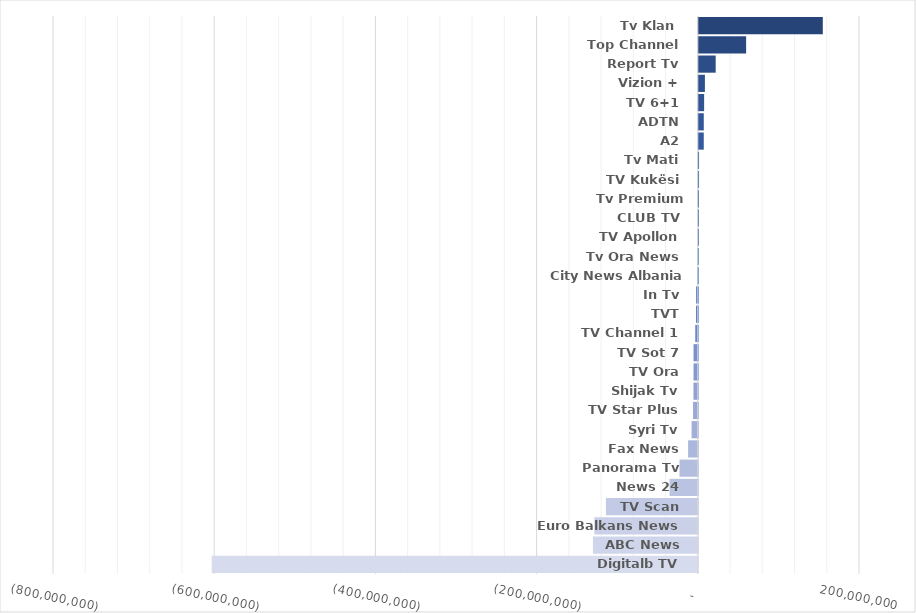
| Category | Fitim 2022 |
|---|---|
| Digitalb TV | -603010538 |
| ABC News | -130083638 |
| Euro Balkans News | -128360592 |
| TV Scan | -113969433 |
| News 24 | -35031177 |
| Panorama Tv | -22717910 |
| Fax News | -12006477 |
| Syri Tv | -7700596 |
| TV Star Plus | -5917843 |
| Shijak Tv | -5354808 |
| TV Ora | -5289689 |
| TV Sot 7 | -5286712 |
| TV Channel 1 | -3160312 |
| TVT | -2179603 |
| In Tv | -2000303 |
| City News Albania HD | -853783 |
| Tv Ora News | -499295 |
| TV Apollon | 158505 |
| CLUB TV | 200912 |
| Tv Premium Channel | 235005 |
| TV Kukësi | 303329 |
| Tv Mati | 320298 |
| A2 | 6170647 |
| ADTN | 6181443 |
| TV 6+1 | 6603911 |
| Vizion + | 7581014 |
| Report Tv | 20955408 |
| Top Channel | 58722790 |
| Tv Klan  | 153841303 |